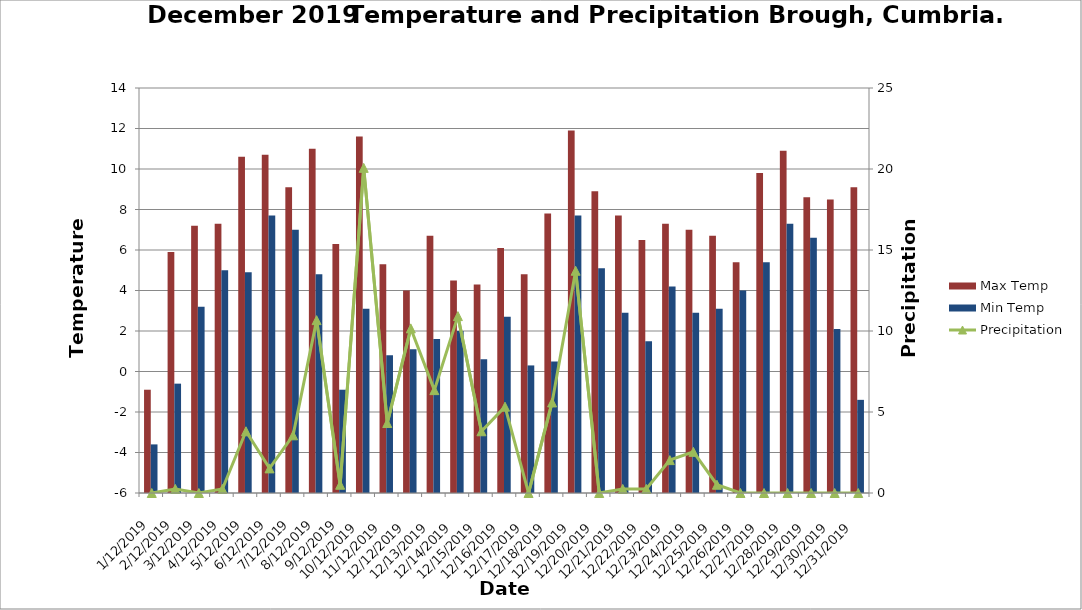
| Category | Max Temp | Min Temp |
|---|---|---|
| 12/01/2019 | -0.9 | -3.6 |
| 12/02/2019 | 5.9 | -0.6 |
| 12/03/2019 | 7.2 | 3.2 |
| 12/04/2019 | 7.3 | 5 |
| 12/05/2019 | 10.6 | 4.9 |
| 12/06/2019 | 10.7 | 7.7 |
| 12/07/2019 | 9.1 | 7 |
| 12/08/2019 | 11 | 4.8 |
| 12/09/2019 | 6.3 | -0.9 |
| 12/10/2019 | 11.6 | 3.1 |
| 12/11/2019 | 5.3 | 0.8 |
| 12/12/2019 | 4 | 1.1 |
| 12/13/2019 | 6.7 | 1.6 |
| 12/14/2019 | 4.5 | 2 |
| 12/15/2019 | 4.3 | 0.6 |
| 12/16/2019 | 6.1 | 2.7 |
| 12/17/2019 | 4.8 | 0.3 |
| 12/18/2019 | 7.8 | 0.5 |
| 12/19/2019 | 11.9 | 7.7 |
| 12/20/2019 | 8.9 | 5.1 |
| 12/21/2019 | 7.7 | 2.9 |
| 12/22/2019 | 6.5 | 1.5 |
| 12/23/2019 | 7.3 | 4.2 |
| 12/24/2019 | 7 | 2.9 |
| 12/25/2019 | 6.7 | 3.1 |
| 12/26/2019 | 5.4 | 4 |
| 12/27/2019 | 9.8 | 5.4 |
| 12/28/2019 | 10.9 | 7.3 |
| 12/29/2019 | 8.6 | 6.6 |
| 12/30/2019 | 8.5 | 2.1 |
| 12/31/2019 | 9.1 | -1.4 |